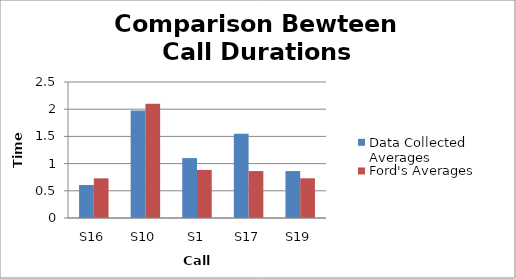
| Category | Data Collected Averages | Ford's Averages |
|---|---|---|
| S16 | 0.607 | 0.729 |
| S10 | 1.977 | 2.1 |
| S1 | 1.101 | 0.884 |
| S17 | 1.547 | 0.863 |
| S19 | 0.863 | 0.73 |